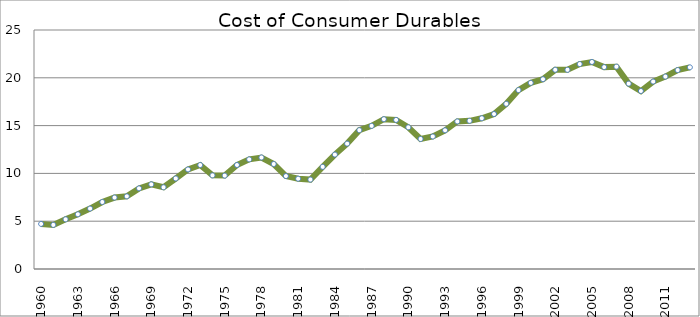
| Category | Series 0 |
|---|---|
| 1960.0 | 4.716 |
| 1961.0 | 4.613 |
| 1962.0 | 5.197 |
| 1963.0 | 5.723 |
| 1964.0 | 6.322 |
| 1965.0 | 7.009 |
| 1966.0 | 7.473 |
| 1967.0 | 7.601 |
| 1968.0 | 8.434 |
| 1969.0 | 8.855 |
| 1970.0 | 8.55 |
| 1971.0 | 9.469 |
| 1972.0 | 10.413 |
| 1973.0 | 10.875 |
| 1974.0 | 9.793 |
| 1975.0 | 9.771 |
| 1976.0 | 10.88 |
| 1977.0 | 11.465 |
| 1978.0 | 11.664 |
| 1979.0 | 10.982 |
| 1980.0 | 9.723 |
| 1981.0 | 9.446 |
| 1982.0 | 9.355 |
| 1983.0 | 10.684 |
| 1984.0 | 11.969 |
| 1985.0 | 13.114 |
| 1986.0 | 14.522 |
| 1987.0 | 14.972 |
| 1988.0 | 15.669 |
| 1989.0 | 15.593 |
| 1990.0 | 14.822 |
| 1991.0 | 13.602 |
| 1992.0 | 13.861 |
| 1993.0 | 14.507 |
| 1994.0 | 15.435 |
| 1995.0 | 15.501 |
| 1996.0 | 15.769 |
| 1997.0 | 16.212 |
| 1998.0 | 17.277 |
| 1999.0 | 18.717 |
| 2000.0 | 19.468 |
| 2001.0 | 19.851 |
| 2002.0 | 20.84 |
| 2003.0 | 20.835 |
| 2004.0 | 21.437 |
| 2005.0 | 21.654 |
| 2006.0 | 21.118 |
| 2007.0 | 21.163 |
| 2008.0 | 19.391 |
| 2009.0 | 18.619 |
| 2010.0 | 19.607 |
| 2011.0 | 20.129 |
| 2012.0 | 20.807 |
| 2013.0 | 21.096 |